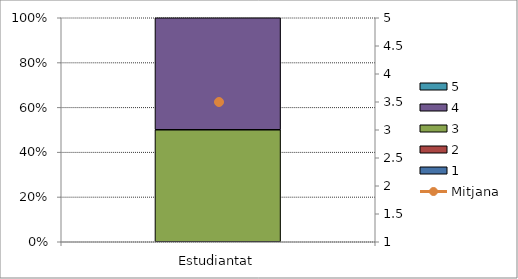
| Category | 1 | 2 | 3 | 4 | 5 |
|---|---|---|---|---|---|
| Estudiantat | 0 | 0 | 2 | 2 | 0 |